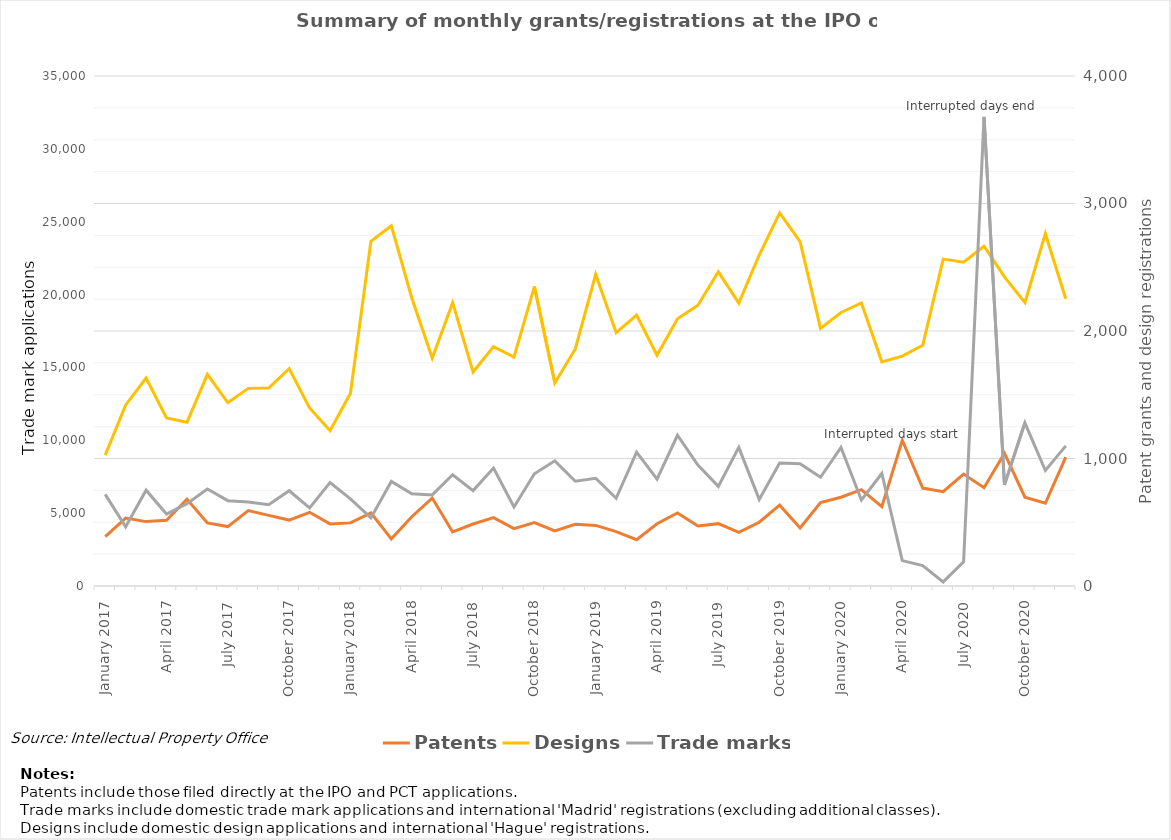
| Category | Patents | Designs |
|---|---|---|
| January 2017 | 387 | 1026 |
| February 2017 | 533 | 1420 |
| March 2017 | 505 | 1631 |
| April 2017 | 516 | 1318 |
| May 2017 | 681 | 1284 |
| June 2017 | 495 | 1660 |
| July 2017 | 466 | 1437 |
| August 2017 | 592 | 1550 |
| September 2017 | 554 | 1553 |
| October 2017 | 517 | 1705 |
| November 2017 | 578 | 1397 |
| December 2017 | 487 | 1218 |
| January 2018 | 495 | 1512 |
| February 2018 | 574 | 2704 |
| March 2018 | 370 | 2825 |
| April 2018 | 543 | 2259 |
| May 2018 | 690 | 1789 |
| June 2018 | 424 | 2222 |
| July 2018 | 486 | 1678 |
| August 2018 | 536 | 1878 |
| September 2018 | 450 | 1795 |
| October 2018 | 498 | 2348 |
| November 2018 | 432 | 1592 |
| December 2018 | 484 | 1859 |
| January 2019 | 475 | 2444 |
| February 2019 | 426 | 1987 |
| March 2019 | 363 | 2125 |
| April 2019 | 488 | 1810 |
| May 2019 | 573 | 2096 |
| June 2019 | 471 | 2202 |
| July 2019 | 489 | 2464 |
| August 2019 | 420 | 2219 |
| September 2019 | 500 | 2596 |
| October 2019 | 634 | 2926 |
| November 2019 | 455 | 2700 |
| December 2019 | 654 | 2021 |
| January 2020 | 696 | 2145 |
| February 2020 | 756 | 2220 |
| March 2020 | 622 | 1758 |
| April 2020 | 1143 | 1803 |
| May 2020 | 768 | 1888 |
| June 2020 | 740 | 2564 |
| July 2020 | 878 | 2539 |
| August 2020 | 771 | 2665 |
| September 2020 | 1042 | 2425 |
| October 2020 | 697 | 2223 |
| November 2020 | 649 | 2763 |